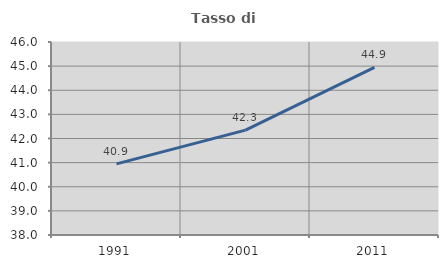
| Category | Tasso di occupazione   |
|---|---|
| 1991.0 | 40.95 |
| 2001.0 | 42.347 |
| 2011.0 | 44.95 |